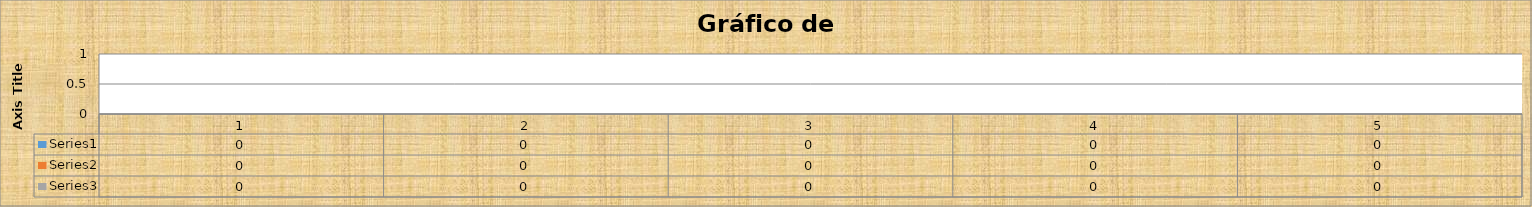
| Category | Series 0 | Series 1 | Series 2 |
|---|---|---|---|
| 0 | 0 | 0 | 0 |
| 1 | 0 | 0 | 0 |
| 2 | 0 | 0 | 0 |
| 3 | 0 | 0 | 0 |
| 4 | 0 | 0 | 0 |